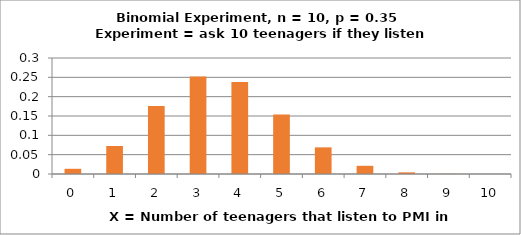
| Category | P(X) |
|---|---|
| 0.0 | 0.013 |
| 1.0 | 0.072 |
| 2.0 | 0.176 |
| 3.0 | 0.252 |
| 4.0 | 0.238 |
| 5.0 | 0.154 |
| 6.0 | 0.069 |
| 7.0 | 0.021 |
| 8.0 | 0.004 |
| 9.0 | 0.001 |
| 10.0 | 0 |